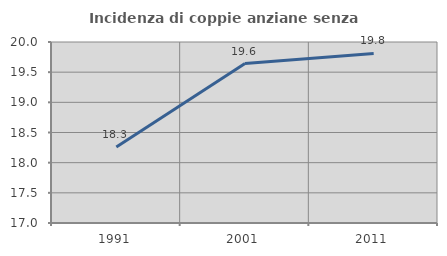
| Category | Incidenza di coppie anziane senza figli  |
|---|---|
| 1991.0 | 18.261 |
| 2001.0 | 19.643 |
| 2011.0 | 19.811 |